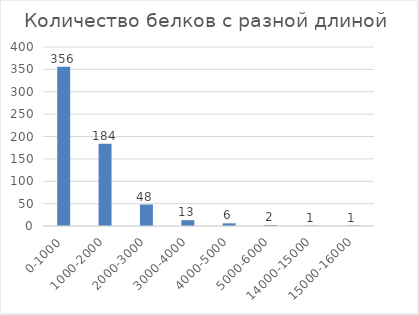
| Category | Количество белков с разной длиной  |
|---|---|
| 0-1000 | 356 |
| 1000-2000 | 184 |
| 2000-3000 | 48 |
| 3000-4000 | 13 |
| 4000-5000 | 6 |
| 5000-6000 | 2 |
| 14000-15000 | 1 |
| 15000-16000 | 1 |